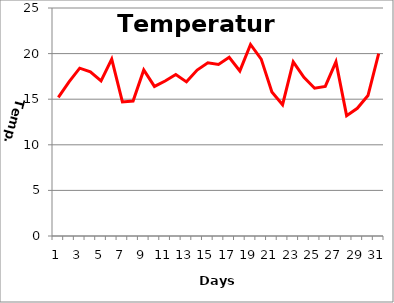
| Category | Series 0 |
|---|---|
| 0 | 15.2 |
| 1 | 16.9 |
| 2 | 18.4 |
| 3 | 18 |
| 4 | 17 |
| 5 | 19.4 |
| 6 | 14.7 |
| 7 | 14.8 |
| 8 | 18.2 |
| 9 | 16.4 |
| 10 | 17 |
| 11 | 17.7 |
| 12 | 16.9 |
| 13 | 18.2 |
| 14 | 19 |
| 15 | 18.8 |
| 16 | 19.6 |
| 17 | 18.1 |
| 18 | 21 |
| 19 | 19.4 |
| 20 | 15.8 |
| 21 | 14.4 |
| 22 | 19.1 |
| 23 | 17.4 |
| 24 | 16.2 |
| 25 | 16.4 |
| 26 | 19.1 |
| 27 | 13.2 |
| 28 | 14 |
| 29 | 15.4 |
| 30 | 20 |